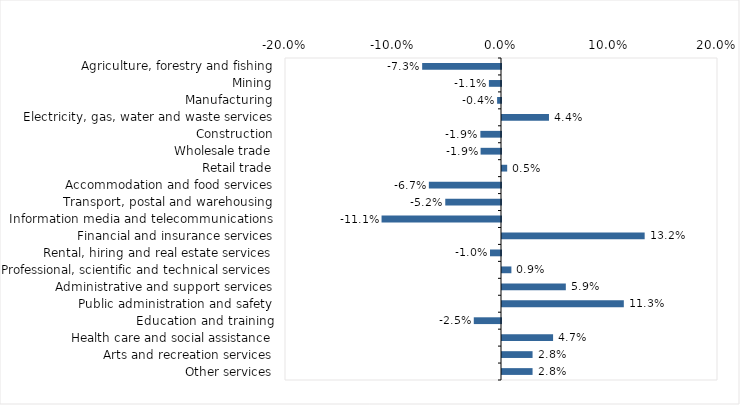
| Category | This week |
|---|---|
| Agriculture, forestry and fishing | -0.073 |
| Mining | -0.011 |
| Manufacturing | -0.004 |
| Electricity, gas, water and waste services | 0.044 |
| Construction | -0.019 |
| Wholesale trade | -0.019 |
| Retail trade | 0.005 |
| Accommodation and food services | -0.067 |
| Transport, postal and warehousing | -0.052 |
| Information media and telecommunications | -0.111 |
| Financial and insurance services | 0.132 |
| Rental, hiring and real estate services | -0.01 |
| Professional, scientific and technical services | 0.009 |
| Administrative and support services | 0.059 |
| Public administration and safety | 0.113 |
| Education and training | -0.025 |
| Health care and social assistance | 0.047 |
| Arts and recreation services | 0.028 |
| Other services | 0.028 |